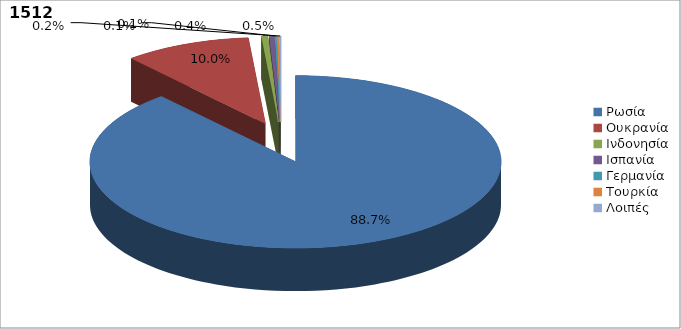
| Category | Series 0 |
|---|---|
| Ρωσία | 0.887 |
| Ουκρανία | 0.1 |
| Ινδονησία | 0.005 |
| Ισπανία | 0.004 |
| Γερμανία | 0.001 |
| Τουρκία | 0.001 |
| Λοιπές | 0.002 |